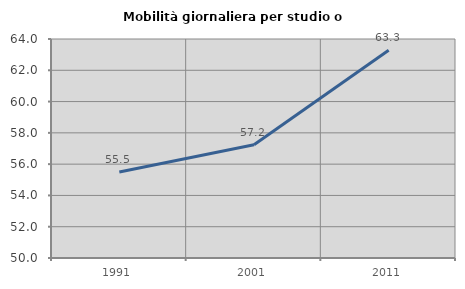
| Category | Mobilità giornaliera per studio o lavoro |
|---|---|
| 1991.0 | 55.493 |
| 2001.0 | 57.241 |
| 2011.0 | 63.279 |